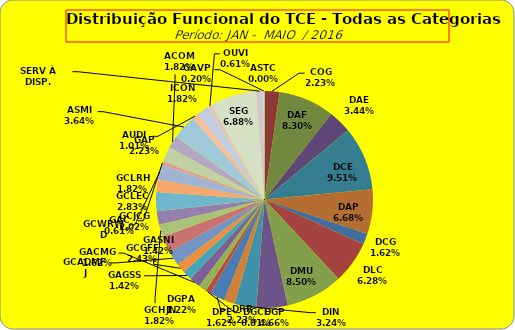
| Category | ASTC |
|---|---|
| ASTC | 0 |
| COG | 11 |
| DAF | 41 |
| DAE | 17 |
| DCE | 47 |
| DAP | 33 |
| DCG | 8 |
| DLC | 31 |
| DMU | 42 |
| DGP | 23 |
| DIN | 16 |
| DPE | 8 |
| DRR | 11 |
| DGCE | 4 |
| DGPA | 6 |
| GACMG | 8 |
| GAGSS | 7 |
| GASNI | 7 |
| GCADMFJ | 11 |
| GCCFF | 12 |
| GCHJN | 9 |
| GCJCG | 10 |
| GCLEC | 14 |
| GCLRH | 9 |
| GCWRWD | 11 |
| GAC | 3 |
| GAP | 11 |
| ACOM | 9 |
| ASMI | 18 |
| AUDI | 5 |
| ICON | 9 |
| OUVI | 3 |
| SEG | 34 |
| SERV À DISP. | 5 |
| GAVP | 1 |